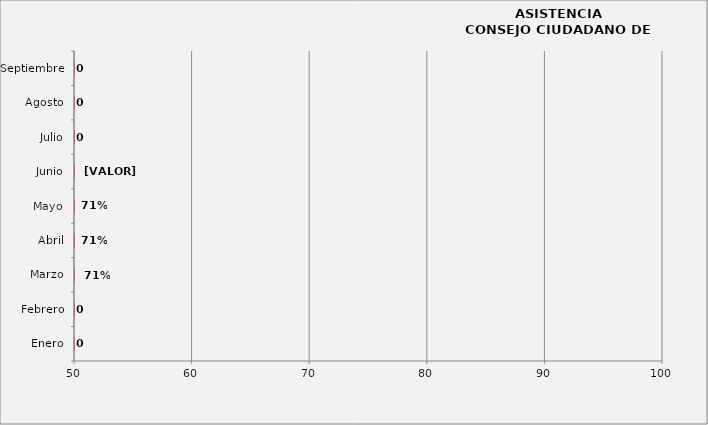
| Category | Series 1 |
|---|---|
| Enero | 0 |
| Febrero | 0 |
| Marzo | 0 |
| Abril | 0 |
| Mayo | 0 |
| Junio | 0 |
| Julio | 0 |
| Agosto | 0 |
| Septiembre | 0 |